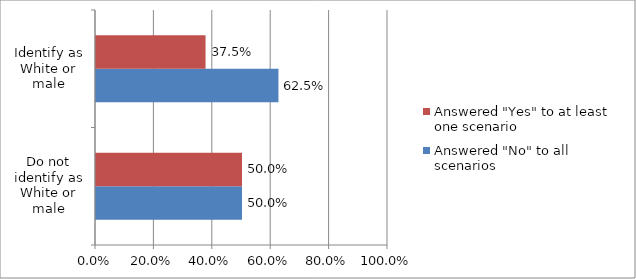
| Category | Answered "No" to all scenarios | Answered "Yes" to at least one scenario |
|---|---|---|
| Do not identify as White or male | 0.5 | 0.5 |
| Identify as White or male | 0.625 | 0.375 |